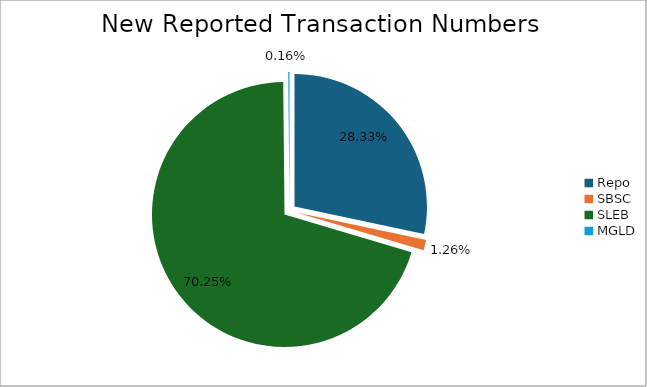
| Category | Series 0 |
|---|---|
| Repo | 384596 |
| SBSC | 17165 |
| SLEB | 953900 |
| MGLD | 2120 |